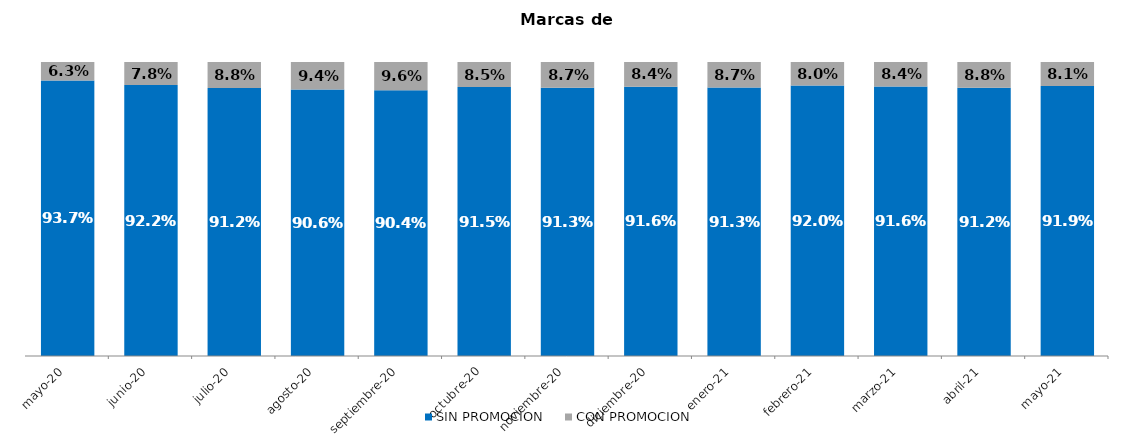
| Category | SIN PROMOCION   | CON PROMOCION   |
|---|---|---|
| 2020-05-01 | 0.937 | 0.063 |
| 2020-06-01 | 0.922 | 0.078 |
| 2020-07-01 | 0.912 | 0.088 |
| 2020-08-01 | 0.906 | 0.094 |
| 2020-09-01 | 0.904 | 0.096 |
| 2020-10-01 | 0.915 | 0.085 |
| 2020-11-01 | 0.913 | 0.087 |
| 2020-12-01 | 0.916 | 0.084 |
| 2021-01-01 | 0.913 | 0.087 |
| 2021-02-01 | 0.92 | 0.08 |
| 2021-03-01 | 0.916 | 0.084 |
| 2021-04-01 | 0.912 | 0.088 |
| 2021-05-01 | 0.919 | 0.081 |